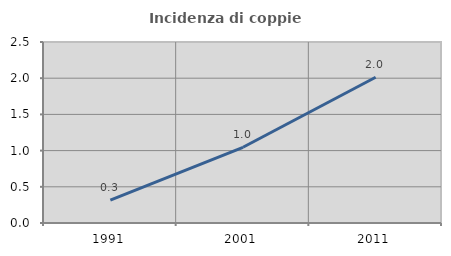
| Category | Incidenza di coppie miste |
|---|---|
| 1991.0 | 0.316 |
| 2001.0 | 1.046 |
| 2011.0 | 2.013 |